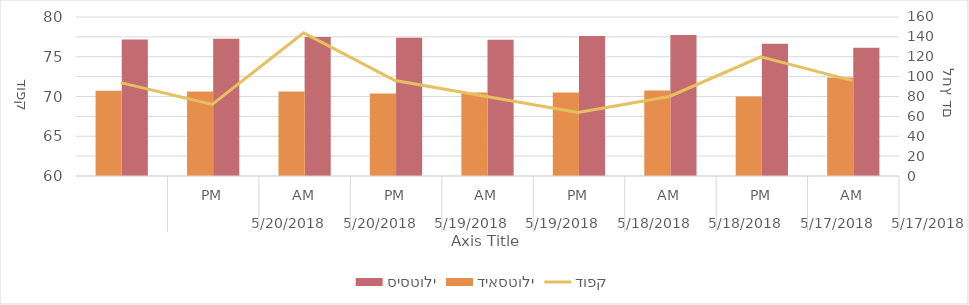
| Category | סיסטולי | דיאסטולי |
|---|---|---|
| 0 | 129 | 99 |
| 1/1/00 | 133 | 80 |
| 1/2/00 | 142 | 86 |
| 1/3/00 | 141 | 84 |
| 1/4/00 | 137 | 84 |
| 1/5/00 | 139 | 83 |
| 1/6/00 | 140 | 85 |
| 1/7/00 | 138 | 85 |